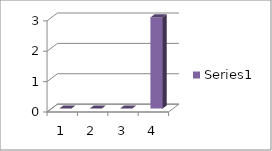
| Category | Series 0 |
|---|---|
| 0 | 0 |
| 1 | 0 |
| 2 | 0 |
| 3 | 3 |